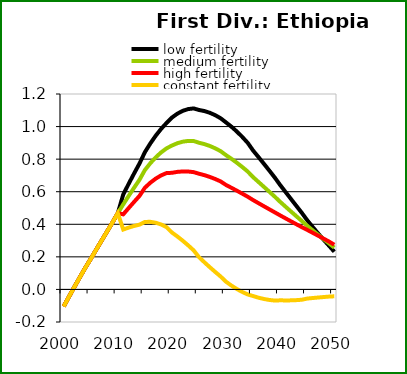
| Category | low fertility | medium fertility | high fertility | constant fertility |
|---|---|---|---|---|
| 2000.0 | -0.104 | -0.104 | -0.104 | -0.104 |
| 2001.0 | -0.043 | -0.043 | -0.043 | -0.043 |
| 2002.0 | 0.017 | 0.017 | 0.017 | 0.017 |
| 2003.0 | 0.076 | 0.076 | 0.076 | 0.076 |
| 2004.0 | 0.134 | 0.134 | 0.134 | 0.134 |
| 2005.0 | 0.188 | 0.188 | 0.188 | 0.188 |
| 2006.0 | 0.244 | 0.244 | 0.244 | 0.244 |
| 2007.0 | 0.3 | 0.3 | 0.3 | 0.3 |
| 2008.0 | 0.355 | 0.355 | 0.355 | 0.355 |
| 2009.0 | 0.41 | 0.41 | 0.41 | 0.41 |
| 2010.0 | 0.469 | 0.469 | 0.469 | 0.469 |
| 2011.0 | 0.583 | 0.522 | 0.461 | 0.368 |
| 2012.0 | 0.648 | 0.574 | 0.5 | 0.38 |
| 2013.0 | 0.712 | 0.624 | 0.537 | 0.39 |
| 2014.0 | 0.773 | 0.673 | 0.574 | 0.398 |
| 2015.0 | 0.843 | 0.733 | 0.624 | 0.415 |
| 2016.0 | 0.896 | 0.775 | 0.655 | 0.415 |
| 2017.0 | 0.944 | 0.811 | 0.68 | 0.41 |
| 2018.0 | 0.986 | 0.841 | 0.7 | 0.399 |
| 2019.0 | 1.022 | 0.866 | 0.714 | 0.382 |
| 2020.0 | 1.055 | 0.883 | 0.716 | 0.35 |
| 2021.0 | 1.079 | 0.898 | 0.722 | 0.325 |
| 2022.0 | 1.097 | 0.907 | 0.724 | 0.299 |
| 2023.0 | 1.107 | 0.912 | 0.724 | 0.271 |
| 2024.0 | 1.112 | 0.911 | 0.72 | 0.24 |
| 2025.0 | 1.102 | 0.901 | 0.71 | 0.198 |
| 2026.0 | 1.095 | 0.892 | 0.702 | 0.167 |
| 2027.0 | 1.085 | 0.881 | 0.691 | 0.136 |
| 2028.0 | 1.07 | 0.866 | 0.678 | 0.107 |
| 2029.0 | 1.051 | 0.849 | 0.663 | 0.079 |
| 2030.0 | 1.025 | 0.824 | 0.641 | 0.047 |
| 2031.0 | 0.999 | 0.802 | 0.624 | 0.023 |
| 2032.0 | 0.969 | 0.778 | 0.606 | 0.002 |
| 2033.0 | 0.936 | 0.752 | 0.588 | -0.016 |
| 2034.0 | 0.9 | 0.724 | 0.569 | -0.031 |
| 2035.0 | 0.853 | 0.689 | 0.549 | -0.041 |
| 2036.0 | 0.812 | 0.66 | 0.53 | -0.051 |
| 2037.0 | 0.771 | 0.63 | 0.511 | -0.059 |
| 2038.0 | 0.73 | 0.6 | 0.492 | -0.065 |
| 2039.0 | 0.687 | 0.57 | 0.473 | -0.068 |
| 2040.0 | 0.641 | 0.538 | 0.455 | -0.067 |
| 2041.0 | 0.598 | 0.508 | 0.436 | -0.068 |
| 2042.0 | 0.555 | 0.478 | 0.418 | -0.067 |
| 2043.0 | 0.512 | 0.449 | 0.4 | -0.066 |
| 2044.0 | 0.47 | 0.42 | 0.382 | -0.063 |
| 2045.0 | 0.425 | 0.391 | 0.366 | -0.056 |
| 2046.0 | 0.384 | 0.363 | 0.348 | -0.053 |
| 2047.0 | 0.344 | 0.336 | 0.33 | -0.05 |
| 2048.0 | 0.306 | 0.309 | 0.312 | -0.047 |
| 2049.0 | 0.269 | 0.284 | 0.294 | -0.044 |
| 2050.0 | 0.232 | 0.257 | 0.274 | -0.042 |